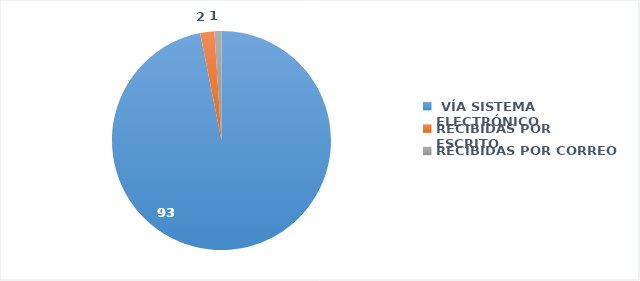
| Category | SOLICITUDES RECIBIDAS |
|---|---|
|  VÍA SISTEMA ELECTRÓNICO | 93 |
| RECIBIDAS POR ESCRITO | 2 |
| RECIBIDAS POR CORREO | 1 |